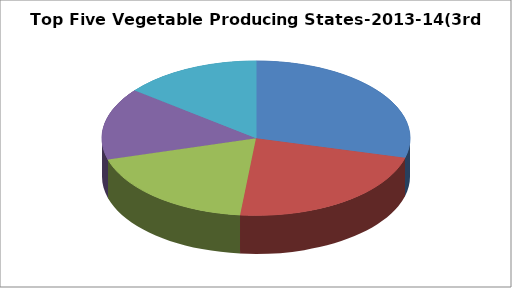
| Category | Series 0 |
|---|---|
| WEST BENGAL | 15.124 |
| UTTAR PRADESH | 11.748 |
| BIHAR | 9.829 |
| MADHYA PRADESH | 7.818 |
| ANDHRA PRADESH | 7.51 |